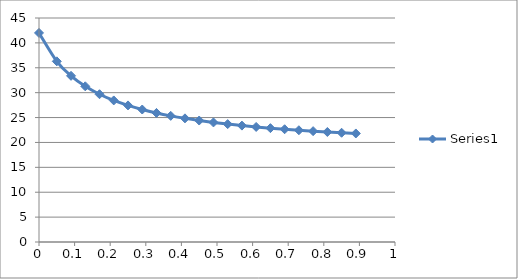
| Category | Series 0 |
|---|---|
| 0.0 | 42 |
| 0.05 | 36.295 |
| 0.09 | 33.383 |
| 0.13 | 31.279 |
| 0.17 | 29.687 |
| 0.21 | 28.441 |
| 0.25 | 27.439 |
| 0.29 | 26.616 |
| 0.33 | 25.927 |
| 0.37 | 25.343 |
| 0.41 | 24.841 |
| 0.45 | 24.404 |
| 0.49 | 24.022 |
| 0.53 | 23.684 |
| 0.57 | 23.383 |
| 0.61 | 23.114 |
| 0.65 | 22.871 |
| 0.69 | 22.651 |
| 0.73 | 22.451 |
| 0.77 | 22.268 |
| 0.81 | 22.1 |
| 0.85 | 21.946 |
| 0.89 | 21.803 |